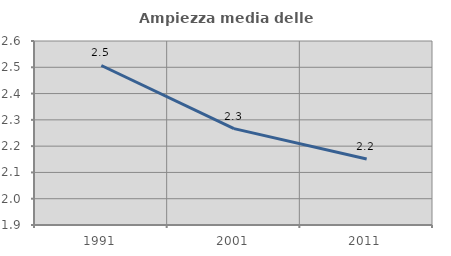
| Category | Ampiezza media delle famiglie |
|---|---|
| 1991.0 | 2.507 |
| 2001.0 | 2.267 |
| 2011.0 | 2.151 |